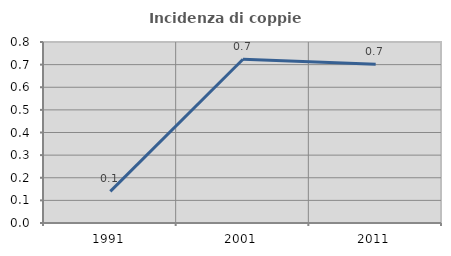
| Category | Incidenza di coppie miste |
|---|---|
| 1991.0 | 0.14 |
| 2001.0 | 0.724 |
| 2011.0 | 0.702 |